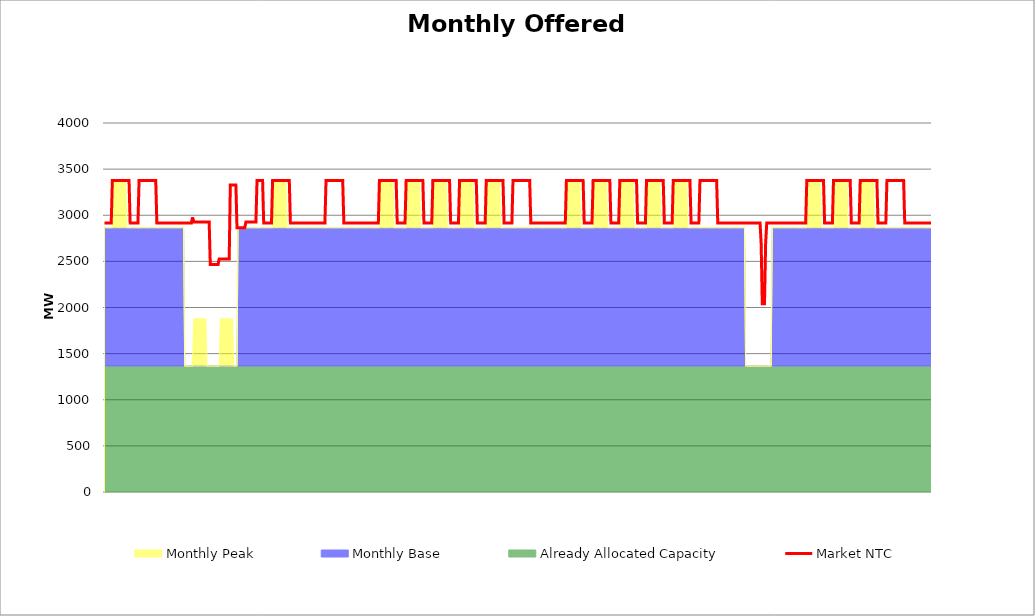
| Category | Market NTC |
|---|---|
| 0 | 2915 |
| 1 | 2915 |
| 2 | 2915 |
| 3 | 2915 |
| 4 | 2915 |
| 5 | 2915 |
| 6 | 2915 |
| 7 | 3377 |
| 8 | 3377 |
| 9 | 3377 |
| 10 | 3377 |
| 11 | 3377 |
| 12 | 3377 |
| 13 | 3377 |
| 14 | 3377 |
| 15 | 3377 |
| 16 | 3377 |
| 17 | 3377 |
| 18 | 3377 |
| 19 | 3377 |
| 20 | 3377 |
| 21 | 3377 |
| 22 | 3377 |
| 23 | 2915 |
| 24 | 2915 |
| 25 | 2915 |
| 26 | 2915 |
| 27 | 2915 |
| 28 | 2915 |
| 29 | 2915 |
| 30 | 2915 |
| 31 | 3377 |
| 32 | 3377 |
| 33 | 3377 |
| 34 | 3377 |
| 35 | 3377 |
| 36 | 3377 |
| 37 | 3377 |
| 38 | 3377 |
| 39 | 3377 |
| 40 | 3377 |
| 41 | 3377 |
| 42 | 3377 |
| 43 | 3377 |
| 44 | 3377 |
| 45 | 3377 |
| 46 | 3377 |
| 47 | 2915 |
| 48 | 2915 |
| 49 | 2915 |
| 50 | 2915 |
| 51 | 2915 |
| 52 | 2915 |
| 53 | 2915 |
| 54 | 2915 |
| 55 | 2915 |
| 56 | 2915 |
| 57 | 2915 |
| 58 | 2915 |
| 59 | 2915 |
| 60 | 2915 |
| 61 | 2915 |
| 62 | 2915 |
| 63 | 2915 |
| 64 | 2915 |
| 65 | 2915 |
| 66 | 2915 |
| 67 | 2915 |
| 68 | 2915 |
| 69 | 2915 |
| 70 | 2915 |
| 71 | 2915 |
| 72 | 2915 |
| 73 | 2915 |
| 74 | 2915 |
| 75 | 2915 |
| 76 | 2915 |
| 77 | 2915 |
| 78 | 2915 |
| 79 | 2977 |
| 80 | 2927 |
| 81 | 2927 |
| 82 | 2927 |
| 83 | 2927 |
| 84 | 2927 |
| 85 | 2927 |
| 86 | 2927 |
| 87 | 2927 |
| 88 | 2927 |
| 89 | 2927 |
| 90 | 2927 |
| 91 | 2927 |
| 92 | 2927 |
| 93 | 2927 |
| 94 | 2927 |
| 95 | 2465 |
| 96 | 2465 |
| 97 | 2465 |
| 98 | 2465 |
| 99 | 2465 |
| 100 | 2465 |
| 101 | 2465 |
| 102 | 2465 |
| 103 | 2527 |
| 104 | 2527 |
| 105 | 2527 |
| 106 | 2527 |
| 107 | 2527 |
| 108 | 2527 |
| 109 | 2527 |
| 110 | 2527 |
| 111 | 2527 |
| 112 | 2527 |
| 113 | 3327 |
| 114 | 3327 |
| 115 | 3327 |
| 116 | 3327 |
| 117 | 3327 |
| 118 | 3327 |
| 119 | 2865 |
| 120 | 2865 |
| 121 | 2865 |
| 122 | 2865 |
| 123 | 2865 |
| 124 | 2865 |
| 125 | 2865 |
| 126 | 2865 |
| 127 | 2927 |
| 128 | 2927 |
| 129 | 2927 |
| 130 | 2927 |
| 131 | 2927 |
| 132 | 2927 |
| 133 | 2927 |
| 134 | 2927 |
| 135 | 2927 |
| 136 | 2927 |
| 137 | 3377 |
| 138 | 3377 |
| 139 | 3377 |
| 140 | 3377 |
| 141 | 3377 |
| 142 | 3377 |
| 143 | 2915 |
| 144 | 2915 |
| 145 | 2915 |
| 146 | 2915 |
| 147 | 2915 |
| 148 | 2915 |
| 149 | 2915 |
| 150 | 2915 |
| 151 | 3377 |
| 152 | 3377 |
| 153 | 3377 |
| 154 | 3377 |
| 155 | 3377 |
| 156 | 3377 |
| 157 | 3377 |
| 158 | 3377 |
| 159 | 3377 |
| 160 | 3377 |
| 161 | 3377 |
| 162 | 3377 |
| 163 | 3377 |
| 164 | 3377 |
| 165 | 3377 |
| 166 | 3377 |
| 167 | 2915 |
| 168 | 2915 |
| 169 | 2915 |
| 170 | 2915 |
| 171 | 2915 |
| 172 | 2915 |
| 173 | 2915 |
| 174 | 2915 |
| 175 | 2915 |
| 176 | 2915 |
| 177 | 2915 |
| 178 | 2915 |
| 179 | 2915 |
| 180 | 2915 |
| 181 | 2915 |
| 182 | 2915 |
| 183 | 2915 |
| 184 | 2915 |
| 185 | 2915 |
| 186 | 2915 |
| 187 | 2915 |
| 188 | 2915 |
| 189 | 2915 |
| 190 | 2915 |
| 191 | 2915 |
| 192 | 2915 |
| 193 | 2915 |
| 194 | 2915 |
| 195 | 2915 |
| 196 | 2915 |
| 197 | 2915 |
| 198 | 2915 |
| 199 | 3377 |
| 200 | 3377 |
| 201 | 3377 |
| 202 | 3377 |
| 203 | 3377 |
| 204 | 3377 |
| 205 | 3377 |
| 206 | 3377 |
| 207 | 3377 |
| 208 | 3377 |
| 209 | 3377 |
| 210 | 3377 |
| 211 | 3377 |
| 212 | 3377 |
| 213 | 3377 |
| 214 | 3377 |
| 215 | 2915 |
| 216 | 2915 |
| 217 | 2915 |
| 218 | 2915 |
| 219 | 2915 |
| 220 | 2915 |
| 221 | 2915 |
| 222 | 2915 |
| 223 | 2915 |
| 224 | 2915 |
| 225 | 2915 |
| 226 | 2915 |
| 227 | 2915 |
| 228 | 2915 |
| 229 | 2915 |
| 230 | 2915 |
| 231 | 2915 |
| 232 | 2915 |
| 233 | 2915 |
| 234 | 2915 |
| 235 | 2915 |
| 236 | 2915 |
| 237 | 2915 |
| 238 | 2915 |
| 239 | 2915 |
| 240 | 2915 |
| 241 | 2915 |
| 242 | 2915 |
| 243 | 2915 |
| 244 | 2915 |
| 245 | 2915 |
| 246 | 2915 |
| 247 | 3377 |
| 248 | 3377 |
| 249 | 3377 |
| 250 | 3377 |
| 251 | 3377 |
| 252 | 3377 |
| 253 | 3377 |
| 254 | 3377 |
| 255 | 3377 |
| 256 | 3377 |
| 257 | 3377 |
| 258 | 3377 |
| 259 | 3377 |
| 260 | 3377 |
| 261 | 3377 |
| 262 | 3377 |
| 263 | 2915 |
| 264 | 2915 |
| 265 | 2915 |
| 266 | 2915 |
| 267 | 2915 |
| 268 | 2915 |
| 269 | 2915 |
| 270 | 2915 |
| 271 | 3377 |
| 272 | 3377 |
| 273 | 3377 |
| 274 | 3377 |
| 275 | 3377 |
| 276 | 3377 |
| 277 | 3377 |
| 278 | 3377 |
| 279 | 3377 |
| 280 | 3377 |
| 281 | 3377 |
| 282 | 3377 |
| 283 | 3377 |
| 284 | 3377 |
| 285 | 3377 |
| 286 | 3377 |
| 287 | 2915 |
| 288 | 2915 |
| 289 | 2915 |
| 290 | 2915 |
| 291 | 2915 |
| 292 | 2915 |
| 293 | 2915 |
| 294 | 2915 |
| 295 | 3377 |
| 296 | 3377 |
| 297 | 3377 |
| 298 | 3377 |
| 299 | 3377 |
| 300 | 3377 |
| 301 | 3377 |
| 302 | 3377 |
| 303 | 3377 |
| 304 | 3377 |
| 305 | 3377 |
| 306 | 3377 |
| 307 | 3377 |
| 308 | 3377 |
| 309 | 3377 |
| 310 | 3377 |
| 311 | 2915 |
| 312 | 2915 |
| 313 | 2915 |
| 314 | 2915 |
| 315 | 2915 |
| 316 | 2915 |
| 317 | 2915 |
| 318 | 2915 |
| 319 | 3377 |
| 320 | 3377 |
| 321 | 3377 |
| 322 | 3377 |
| 323 | 3377 |
| 324 | 3377 |
| 325 | 3377 |
| 326 | 3377 |
| 327 | 3377 |
| 328 | 3377 |
| 329 | 3377 |
| 330 | 3377 |
| 331 | 3377 |
| 332 | 3377 |
| 333 | 3377 |
| 334 | 3377 |
| 335 | 2915 |
| 336 | 2915 |
| 337 | 2915 |
| 338 | 2915 |
| 339 | 2915 |
| 340 | 2915 |
| 341 | 2915 |
| 342 | 2915 |
| 343 | 3377 |
| 344 | 3377 |
| 345 | 3377 |
| 346 | 3377 |
| 347 | 3377 |
| 348 | 3377 |
| 349 | 3377 |
| 350 | 3377 |
| 351 | 3377 |
| 352 | 3377 |
| 353 | 3377 |
| 354 | 3377 |
| 355 | 3377 |
| 356 | 3377 |
| 357 | 3377 |
| 358 | 3377 |
| 359 | 2915 |
| 360 | 2915 |
| 361 | 2915 |
| 362 | 2915 |
| 363 | 2915 |
| 364 | 2915 |
| 365 | 2915 |
| 366 | 2915 |
| 367 | 3377 |
| 368 | 3377 |
| 369 | 3377 |
| 370 | 3377 |
| 371 | 3377 |
| 372 | 3377 |
| 373 | 3377 |
| 374 | 3377 |
| 375 | 3377 |
| 376 | 3377 |
| 377 | 3377 |
| 378 | 3377 |
| 379 | 3377 |
| 380 | 3377 |
| 381 | 3377 |
| 382 | 3377 |
| 383 | 2915 |
| 384 | 2915 |
| 385 | 2915 |
| 386 | 2915 |
| 387 | 2915 |
| 388 | 2915 |
| 389 | 2915 |
| 390 | 2915 |
| 391 | 2915 |
| 392 | 2915 |
| 393 | 2915 |
| 394 | 2915 |
| 395 | 2915 |
| 396 | 2915 |
| 397 | 2915 |
| 398 | 2915 |
| 399 | 2915 |
| 400 | 2915 |
| 401 | 2915 |
| 402 | 2915 |
| 403 | 2915 |
| 404 | 2915 |
| 405 | 2915 |
| 406 | 2915 |
| 407 | 2915 |
| 408 | 2915 |
| 409 | 2915 |
| 410 | 2915 |
| 411 | 2915 |
| 412 | 2915 |
| 413 | 2915 |
| 414 | 2915 |
| 415 | 3377 |
| 416 | 3377 |
| 417 | 3377 |
| 418 | 3377 |
| 419 | 3377 |
| 420 | 3377 |
| 421 | 3377 |
| 422 | 3377 |
| 423 | 3377 |
| 424 | 3377 |
| 425 | 3377 |
| 426 | 3377 |
| 427 | 3377 |
| 428 | 3377 |
| 429 | 3377 |
| 430 | 3377 |
| 431 | 2915 |
| 432 | 2915 |
| 433 | 2915 |
| 434 | 2915 |
| 435 | 2915 |
| 436 | 2915 |
| 437 | 2915 |
| 438 | 2915 |
| 439 | 3377 |
| 440 | 3377 |
| 441 | 3377 |
| 442 | 3377 |
| 443 | 3377 |
| 444 | 3377 |
| 445 | 3377 |
| 446 | 3377 |
| 447 | 3377 |
| 448 | 3377 |
| 449 | 3377 |
| 450 | 3377 |
| 451 | 3377 |
| 452 | 3377 |
| 453 | 3377 |
| 454 | 3377 |
| 455 | 2915 |
| 456 | 2915 |
| 457 | 2915 |
| 458 | 2915 |
| 459 | 2915 |
| 460 | 2915 |
| 461 | 2915 |
| 462 | 2915 |
| 463 | 3377 |
| 464 | 3377 |
| 465 | 3377 |
| 466 | 3377 |
| 467 | 3377 |
| 468 | 3377 |
| 469 | 3377 |
| 470 | 3377 |
| 471 | 3377 |
| 472 | 3377 |
| 473 | 3377 |
| 474 | 3377 |
| 475 | 3377 |
| 476 | 3377 |
| 477 | 3377 |
| 478 | 3377 |
| 479 | 2915 |
| 480 | 2915 |
| 481 | 2915 |
| 482 | 2915 |
| 483 | 2915 |
| 484 | 2915 |
| 485 | 2915 |
| 486 | 2915 |
| 487 | 3377 |
| 488 | 3377 |
| 489 | 3377 |
| 490 | 3377 |
| 491 | 3377 |
| 492 | 3377 |
| 493 | 3377 |
| 494 | 3377 |
| 495 | 3377 |
| 496 | 3377 |
| 497 | 3377 |
| 498 | 3377 |
| 499 | 3377 |
| 500 | 3377 |
| 501 | 3377 |
| 502 | 3377 |
| 503 | 2915 |
| 504 | 2915 |
| 505 | 2915 |
| 506 | 2915 |
| 507 | 2915 |
| 508 | 2915 |
| 509 | 2915 |
| 510 | 2915 |
| 511 | 3377 |
| 512 | 3377 |
| 513 | 3377 |
| 514 | 3377 |
| 515 | 3377 |
| 516 | 3377 |
| 517 | 3377 |
| 518 | 3377 |
| 519 | 3377 |
| 520 | 3377 |
| 521 | 3377 |
| 522 | 3377 |
| 523 | 3377 |
| 524 | 3377 |
| 525 | 3377 |
| 526 | 3377 |
| 527 | 2915 |
| 528 | 2915 |
| 529 | 2915 |
| 530 | 2915 |
| 531 | 2915 |
| 532 | 2915 |
| 533 | 2915 |
| 534 | 2915 |
| 535 | 3377 |
| 536 | 3377 |
| 537 | 3377 |
| 538 | 3377 |
| 539 | 3377 |
| 540 | 3377 |
| 541 | 3377 |
| 542 | 3377 |
| 543 | 3377 |
| 544 | 3377 |
| 545 | 3377 |
| 546 | 3377 |
| 547 | 3377 |
| 548 | 3377 |
| 549 | 3377 |
| 550 | 3377 |
| 551 | 2915 |
| 552 | 2915 |
| 553 | 2915 |
| 554 | 2915 |
| 555 | 2915 |
| 556 | 2915 |
| 557 | 2915 |
| 558 | 2915 |
| 559 | 2915 |
| 560 | 2915 |
| 561 | 2915 |
| 562 | 2915 |
| 563 | 2915 |
| 564 | 2915 |
| 565 | 2915 |
| 566 | 2915 |
| 567 | 2915 |
| 568 | 2915 |
| 569 | 2915 |
| 570 | 2915 |
| 571 | 2915 |
| 572 | 2915 |
| 573 | 2915 |
| 574 | 2915 |
| 575 | 2915 |
| 576 | 2915 |
| 577 | 2915 |
| 578 | 2915 |
| 579 | 2915 |
| 580 | 2915 |
| 581 | 2915 |
| 582 | 2915 |
| 583 | 2915 |
| 584 | 2915 |
| 585 | 2915 |
| 586 | 2915 |
| 587 | 2915 |
| 588 | 2915 |
| 589 | 2915 |
| 590 | 2690 |
| 591 | 2040 |
| 592 | 2040 |
| 593 | 2040 |
| 594 | 2690 |
| 595 | 2915 |
| 596 | 2915 |
| 597 | 2915 |
| 598 | 2915 |
| 599 | 2915 |
| 600 | 2915 |
| 601 | 2915 |
| 602 | 2915 |
| 603 | 2915 |
| 604 | 2915 |
| 605 | 2915 |
| 606 | 2915 |
| 607 | 2915 |
| 608 | 2915 |
| 609 | 2915 |
| 610 | 2915 |
| 611 | 2915 |
| 612 | 2915 |
| 613 | 2915 |
| 614 | 2915 |
| 615 | 2915 |
| 616 | 2915 |
| 617 | 2915 |
| 618 | 2915 |
| 619 | 2915 |
| 620 | 2915 |
| 621 | 2915 |
| 622 | 2915 |
| 623 | 2915 |
| 624 | 2915 |
| 625 | 2915 |
| 626 | 2915 |
| 627 | 2915 |
| 628 | 2915 |
| 629 | 2915 |
| 630 | 2915 |
| 631 | 3377 |
| 632 | 3377 |
| 633 | 3377 |
| 634 | 3377 |
| 635 | 3377 |
| 636 | 3377 |
| 637 | 3377 |
| 638 | 3377 |
| 639 | 3377 |
| 640 | 3377 |
| 641 | 3377 |
| 642 | 3377 |
| 643 | 3377 |
| 644 | 3377 |
| 645 | 3377 |
| 646 | 3377 |
| 647 | 2915 |
| 648 | 2915 |
| 649 | 2915 |
| 650 | 2915 |
| 651 | 2915 |
| 652 | 2915 |
| 653 | 2915 |
| 654 | 2915 |
| 655 | 3377 |
| 656 | 3377 |
| 657 | 3377 |
| 658 | 3377 |
| 659 | 3377 |
| 660 | 3377 |
| 661 | 3377 |
| 662 | 3377 |
| 663 | 3377 |
| 664 | 3377 |
| 665 | 3377 |
| 666 | 3377 |
| 667 | 3377 |
| 668 | 3377 |
| 669 | 3377 |
| 670 | 3377 |
| 671 | 2915 |
| 672 | 2915 |
| 673 | 2915 |
| 674 | 2915 |
| 675 | 2915 |
| 676 | 2915 |
| 677 | 2915 |
| 678 | 2915 |
| 679 | 3377 |
| 680 | 3377 |
| 681 | 3377 |
| 682 | 3377 |
| 683 | 3377 |
| 684 | 3377 |
| 685 | 3377 |
| 686 | 3377 |
| 687 | 3377 |
| 688 | 3377 |
| 689 | 3377 |
| 690 | 3377 |
| 691 | 3377 |
| 692 | 3377 |
| 693 | 3377 |
| 694 | 3377 |
| 695 | 2915 |
| 696 | 2915 |
| 697 | 2915 |
| 698 | 2915 |
| 699 | 2915 |
| 700 | 2915 |
| 701 | 2915 |
| 702 | 2915 |
| 703 | 3377 |
| 704 | 3377 |
| 705 | 3377 |
| 706 | 3377 |
| 707 | 3377 |
| 708 | 3377 |
| 709 | 3377 |
| 710 | 3377 |
| 711 | 3377 |
| 712 | 3377 |
| 713 | 3377 |
| 714 | 3377 |
| 715 | 3377 |
| 716 | 3377 |
| 717 | 3377 |
| 718 | 3377 |
| 719 | 2915 |
| 720 | 2915 |
| 721 | 2915 |
| 722 | 2915 |
| 723 | 2915 |
| 724 | 2915 |
| 725 | 2915 |
| 726 | 2915 |
| 727 | 2915 |
| 728 | 2915 |
| 729 | 2915 |
| 730 | 2915 |
| 731 | 2915 |
| 732 | 2915 |
| 733 | 2915 |
| 734 | 2915 |
| 735 | 2915 |
| 736 | 2915 |
| 737 | 2915 |
| 738 | 2915 |
| 739 | 2915 |
| 740 | 2915 |
| 741 | 2915 |
| 742 | 2915 |
| 743 | 2915 |